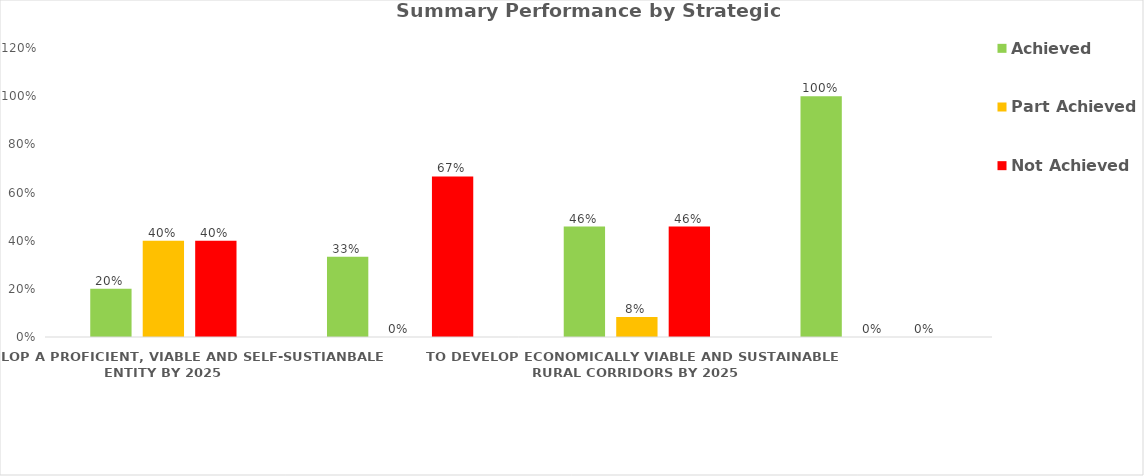
| Category | Achieved | Part Achieved | Not Achieved |
|---|---|---|---|
| TO DEVELOP A PROFICIENT, VIABLE AND SELF-SUSTIANBALE ENTITY BY 2025 | 0.2 | 0.4 | 0.4 |
| TO MOBILISE FUNDING AND FACILITATE INVESTMENT PROMOTION INTO THE DISTRICT BY 2025 | 0.333 | 0 | 0.667 |
| TO DEVELOP ECONOMICALLY VIABLE AND SUSTAINABLE RURAL CORRIDORS BY 2025 | 0.458 | 0.083 | 0.458 |
| TO SUPORT IMPLEMENTATION OF INFRASTRUCTURE PROJECTS IN THE DISTRICT BY 2025 | 1 | 0 | 0 |